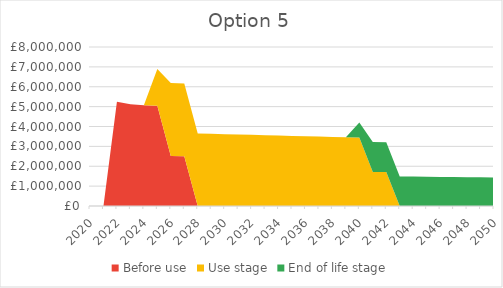
| Category | Before use | Use stage | End of life stage |
|---|---|---|---|
| 2020 | 0 | 0 | 0 |
| 2021 | 0 | 0 | 0 |
| 2022 | 5240291.981 | 0 | 0 |
| 2023 | 5120012.326 | 0 | 0 |
| 2024 | 5069475.988 | 0 | 0 |
| 2025 | 5042788.002 | 1850564.404 | 0 |
| 2026 | 2509984.978 | 3684381.62 | 0 |
| 2027 | 2498053.974 | 3666868.219 | 0 |
| 2028 | 0 | 3648625.094 | 0 |
| 2029 | 0 | 3629687.593 | 0 |
| 2030 | 0 | 3610089.962 | 0 |
| 2031 | 0 | 3602505.739 | 0 |
| 2032 | 0 | 3581438.454 | 0 |
| 2033 | 0 | 3559812.291 | 0 |
| 2034 | 0 | 3549568.57 | 0 |
| 2035 | 0 | 3526680.182 | 0 |
| 2036 | 0 | 3514773.457 | 0 |
| 2037 | 0 | 3501977.769 | 0 |
| 2038 | 0 | 3477328.353 | 0 |
| 2039 | 0 | 3463087.619 | 0 |
| 2040 | 0 | 3448068.425 | 754264.968 |
| 2041 | 0 | 1716153.387 | 1501634.214 |
| 2042 | 0 | 1707918.779 | 1494428.932 |
| 2043 | 0 | 0 | 1486928.88 |
| 2044 | 0 | 0 | 1479148.388 |
| 2045 | 0 | 0 | 1471101.338 |
| 2046 | 0 | 0 | 1462801.174 |
| 2047 | 0 | 0 | 1458289.34 |
| 2048 | 0 | 0 | 1449442.606 |
| 2049 | 0 | 0 | 1444254.132 |
| 2050 | 0 | 0 | 1434915.791 |